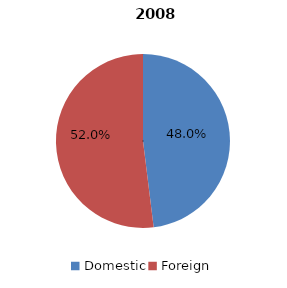
| Category | 2008 |
|---|---|
| Domestic | 463817836 |
| Foreign | 501600732 |